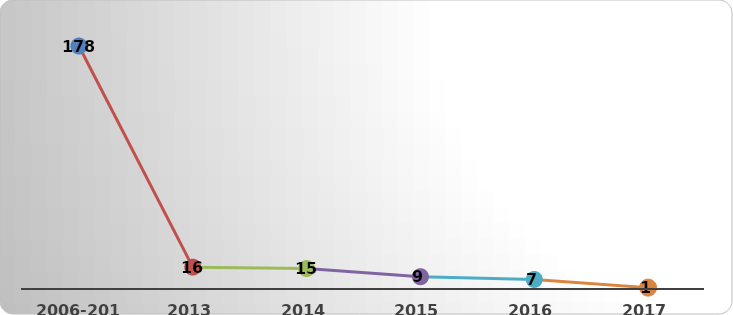
| Category | Total |
|---|---|
| 2006-2012 | 178 |
| 2013 | 16 |
| 2014 | 15 |
| 2015 | 9 |
| 2016 | 7 |
| 2017 | 1 |